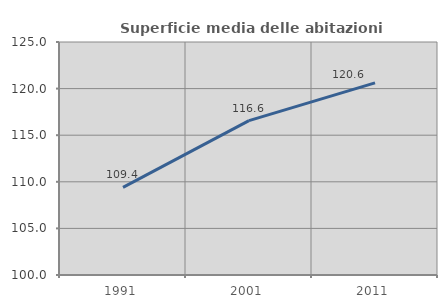
| Category | Superficie media delle abitazioni occupate |
|---|---|
| 1991.0 | 109.396 |
| 2001.0 | 116.566 |
| 2011.0 | 120.61 |